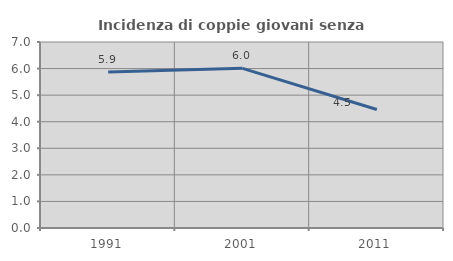
| Category | Incidenza di coppie giovani senza figli |
|---|---|
| 1991.0 | 5.869 |
| 2001.0 | 6.009 |
| 2011.0 | 4.458 |